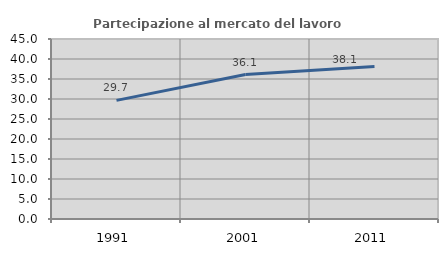
| Category | Partecipazione al mercato del lavoro  femminile |
|---|---|
| 1991.0 | 29.659 |
| 2001.0 | 36.119 |
| 2011.0 | 38.107 |